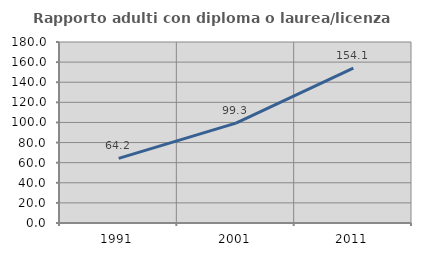
| Category | Rapporto adulti con diploma o laurea/licenza media  |
|---|---|
| 1991.0 | 64.246 |
| 2001.0 | 99.284 |
| 2011.0 | 154.094 |